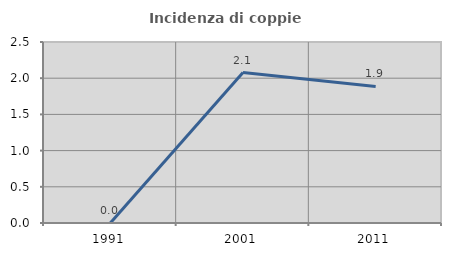
| Category | Incidenza di coppie miste |
|---|---|
| 1991.0 | 0 |
| 2001.0 | 2.078 |
| 2011.0 | 1.887 |